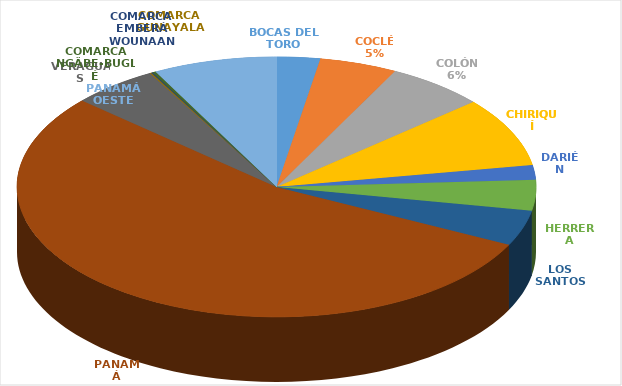
| Category | Cantidad  |
|---|---|
| BOCAS DEL TORO | 170 |
| COCLÉ | 304 |
| COLÓN | 386 |
| CHIRIQUÍ | 542 |
| DARIÉN | 114 |
| HERRERA | 241 |
| LOS SANTOS | 277 |
| PANAMÁ | 3407 |
| VERAGUAS | 337 |
| COMARCA GUNAYALA | 6 |
| COMARCA EMBERÁ WOUNAAN | 5 |
| COMARCA NGÄBE-BUGLÉ | 14 |
| PANAMÁ OESTE | 484 |